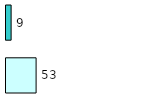
| Category | Series 0 | Series 1 |
|---|---|---|
| 0 | 53 | 9 |